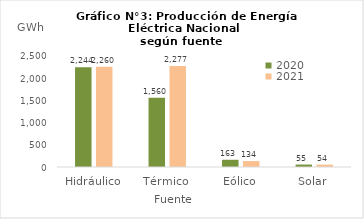
| Category | 2020 | 2021 |
|---|---|---|
| Hidráulico | 2243.908 | 2259.647 |
| Térmico | 1560.202 | 2276.564 |
| Eólico | 162.692 | 134.189 |
| Solar | 55.072 | 54.263 |